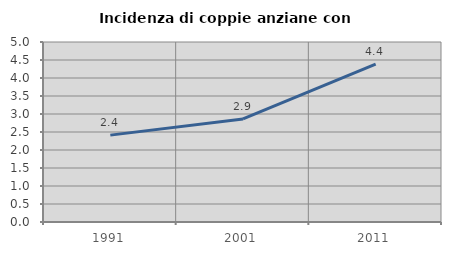
| Category | Incidenza di coppie anziane con figli |
|---|---|
| 1991.0 | 2.413 |
| 2001.0 | 2.862 |
| 2011.0 | 4.386 |